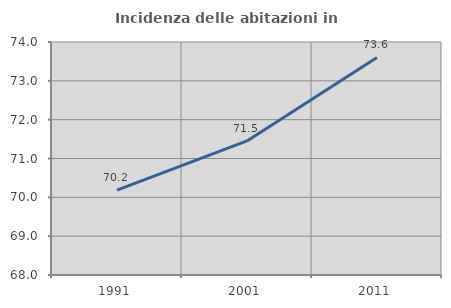
| Category | Incidenza delle abitazioni in proprietà  |
|---|---|
| 1991.0 | 70.186 |
| 2001.0 | 71.453 |
| 2011.0 | 73.601 |